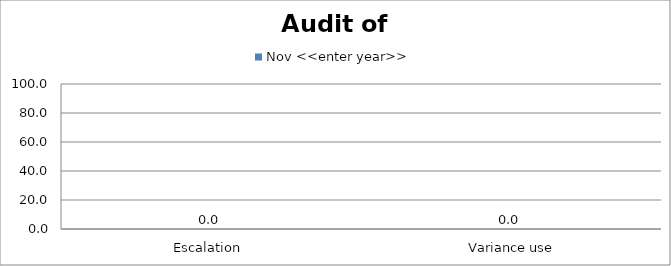
| Category | Nov <<enter year>> |
|---|---|
| Escalation  | 0 |
|  Variance use | 0 |